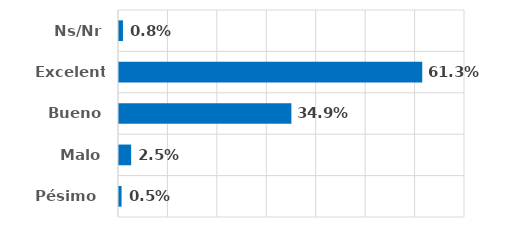
| Category | Series 0 |
|---|---|
| Pésimo  | 0.005 |
| Malo | 0.025 |
| Bueno | 0.349 |
| Excelente | 0.613 |
| Ns/Nr | 0.008 |